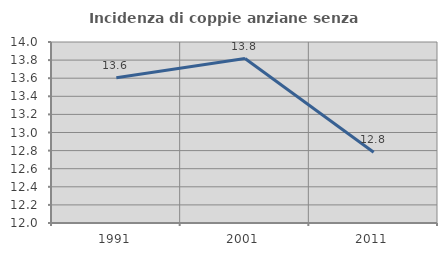
| Category | Incidenza di coppie anziane senza figli  |
|---|---|
| 1991.0 | 13.604 |
| 2001.0 | 13.817 |
| 2011.0 | 12.781 |